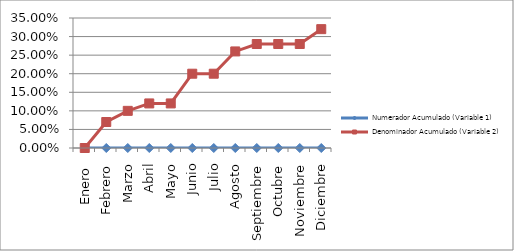
| Category | Numerador Acumulado (Variable 1) | Denominador Acumulado (Variable 2) |
|---|---|---|
| Enero  | 0 | 0 |
| Febrero | 0 | 0.07 |
| Marzo | 0 | 0.1 |
| Abril | 0 | 0.12 |
| Mayo | 0 | 0.12 |
| Junio | 0 | 0.2 |
| Julio | 0 | 0.2 |
| Agosto | 0 | 0.26 |
| Septiembre | 0 | 0.28 |
| Octubre | 0 | 0.28 |
| Noviembre | 0 | 0.28 |
| Diciembre | 0 | 0.32 |